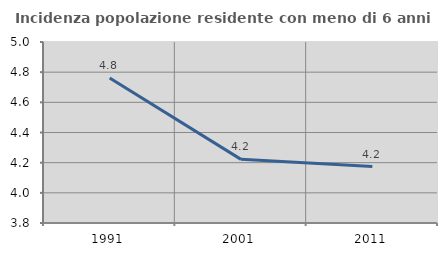
| Category | Incidenza popolazione residente con meno di 6 anni |
|---|---|
| 1991.0 | 4.762 |
| 2001.0 | 4.222 |
| 2011.0 | 4.174 |